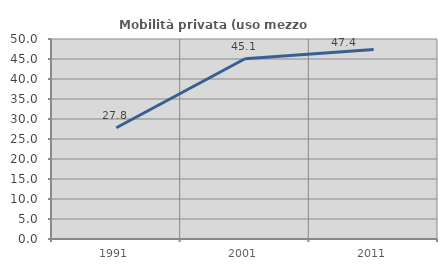
| Category | Mobilità privata (uso mezzo privato) |
|---|---|
| 1991.0 | 27.806 |
| 2001.0 | 45.068 |
| 2011.0 | 47.377 |